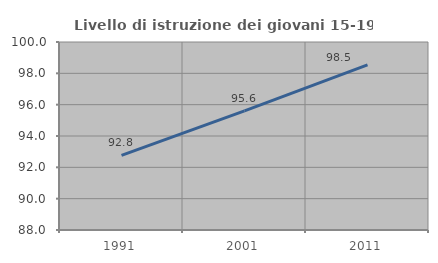
| Category | Livello di istruzione dei giovani 15-19 anni |
|---|---|
| 1991.0 | 92.76 |
| 2001.0 | 95.604 |
| 2011.0 | 98.54 |